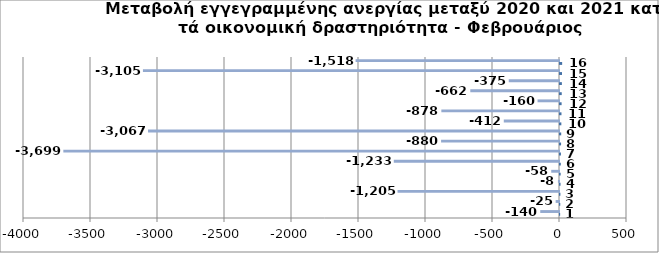
| Category | Series 0 | Series 1 |
|---|---|---|
| 0 | 1 | -140 |
| 1 | 2 | -25 |
| 2 | 3 | -1205 |
| 3 | 4 | -8 |
| 4 | 5 | -58 |
| 5 | 6 | -1233 |
| 6 | 7 | -3699 |
| 7 | 8 | -880 |
| 8 | 9 | -3067 |
| 9 | 10 | -412 |
| 10 | 11 | -878 |
| 11 | 12 | -160 |
| 12 | 13 | -662 |
| 13 | 14 | -375 |
| 14 | 15 | -3105 |
| 15 | 16 | -1518 |